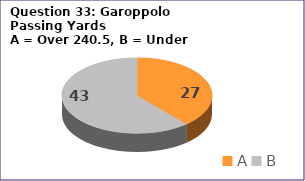
| Category | Series 0 |
|---|---|
| A | 27 |
| B | 43 |